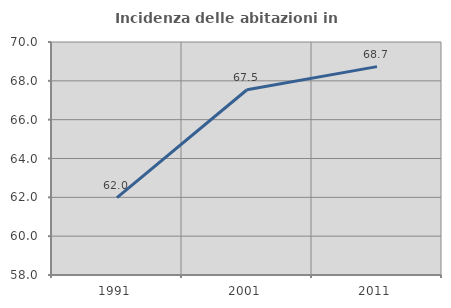
| Category | Incidenza delle abitazioni in proprietà  |
|---|---|
| 1991.0 | 61.99 |
| 2001.0 | 67.54 |
| 2011.0 | 68.731 |